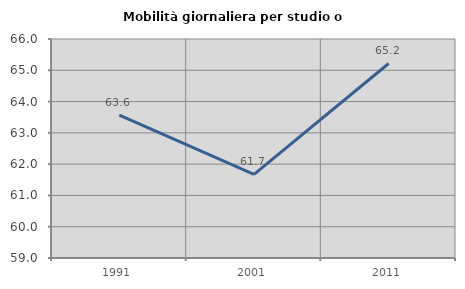
| Category | Mobilità giornaliera per studio o lavoro |
|---|---|
| 1991.0 | 63.565 |
| 2001.0 | 61.673 |
| 2011.0 | 65.217 |